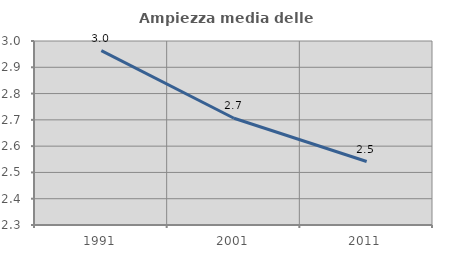
| Category | Ampiezza media delle famiglie |
|---|---|
| 1991.0 | 2.963 |
| 2001.0 | 2.706 |
| 2011.0 | 2.542 |